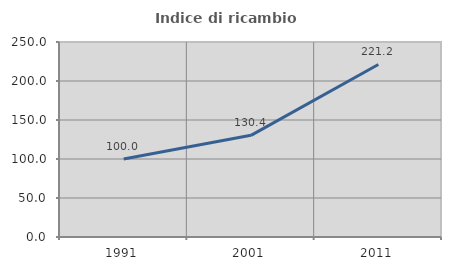
| Category | Indice di ricambio occupazionale  |
|---|---|
| 1991.0 | 100 |
| 2001.0 | 130.357 |
| 2011.0 | 221.212 |